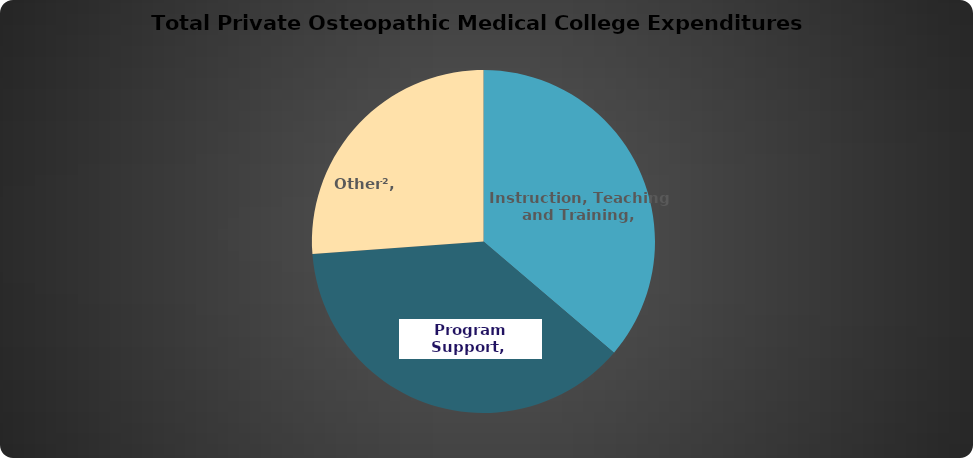
| Category | Series 0 |
|---|---|
| 0 | 457522142.24 |
| 1 | 474696395.03 |
| 2 | 330436554.91 |